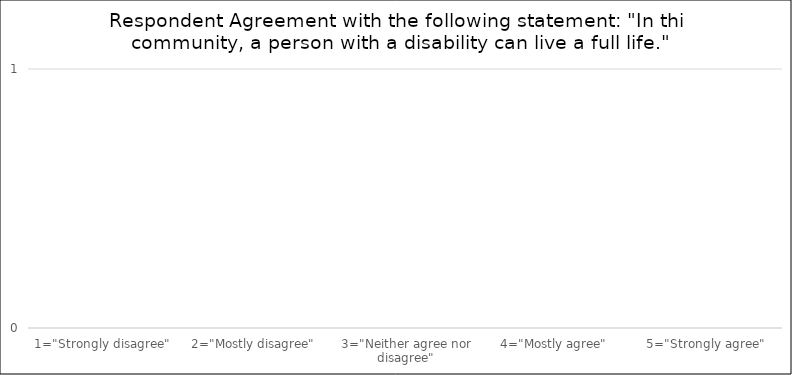
| Category | Number of Responses |
|---|---|
| 1="Strongly disagree" | 0 |
| 2="Mostly disagree" | 0 |
| 3="Neither agree nor disagree" | 0 |
| 4="Mostly agree" | 0 |
| 5="Strongly agree" | 0 |